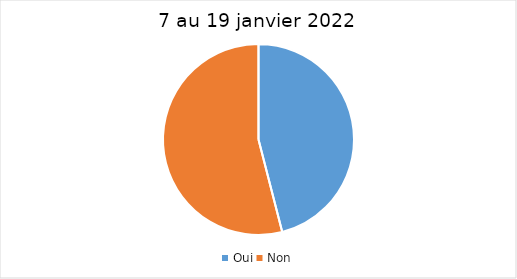
| Category | 7 au 19 janvier 2022 |
|---|---|
| Oui | 46 |
| Non | 54 |